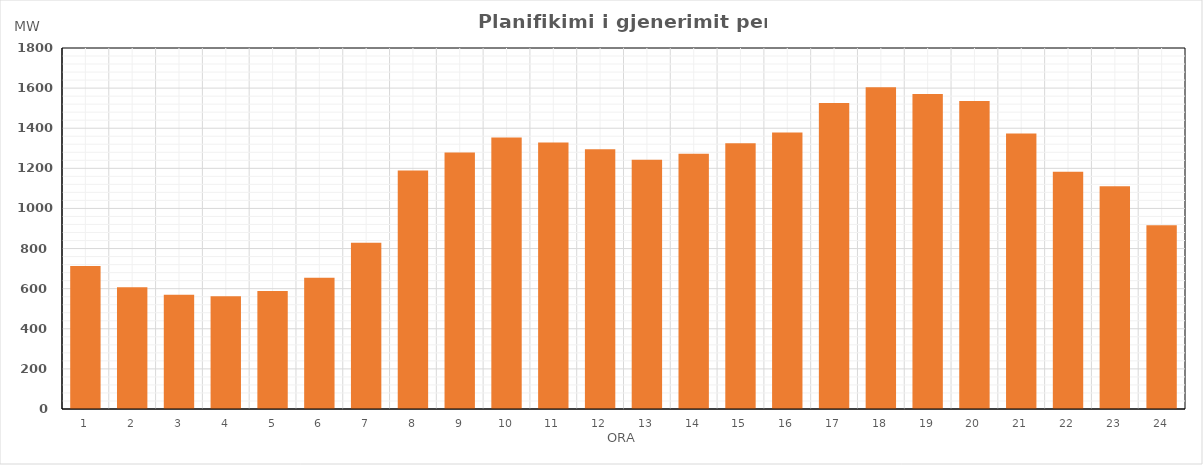
| Category | Max (MW) |
|---|---|
| 0 | 713.131 |
| 1 | 606.465 |
| 2 | 569.147 |
| 3 | 562.048 |
| 4 | 588.333 |
| 5 | 654.655 |
| 6 | 828.642 |
| 7 | 1189.141 |
| 8 | 1278.865 |
| 9 | 1354.313 |
| 10 | 1328.262 |
| 11 | 1294.949 |
| 12 | 1242.419 |
| 13 | 1272.748 |
| 14 | 1324.718 |
| 15 | 1378.099 |
| 16 | 1525.943 |
| 17 | 1604.683 |
| 18 | 1570.566 |
| 19 | 1535.25 |
| 20 | 1373.686 |
| 21 | 1183.226 |
| 22 | 1110.723 |
| 23 | 916.251 |